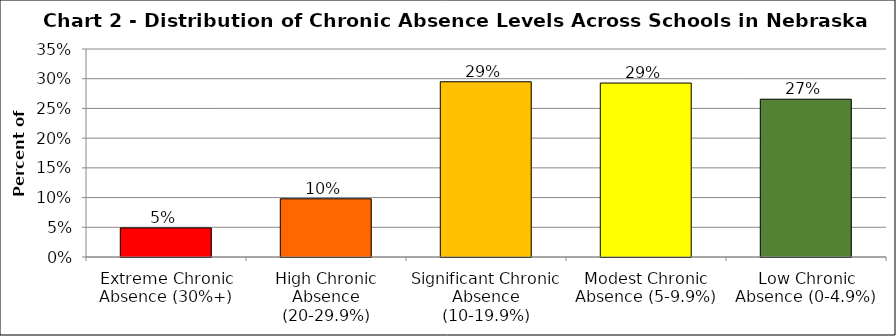
| Category | Series 1 |
|---|---|
| Extreme Chronic Absence (30%+) | 0.049 |
| High Chronic Absence (20-29.9%) | 0.098 |
| Significant Chronic Absence (10-19.9%) | 0.295 |
| Modest Chronic Absence (5-9.9%) | 0.293 |
| Low Chronic Absence (0-4.9%) | 0.266 |